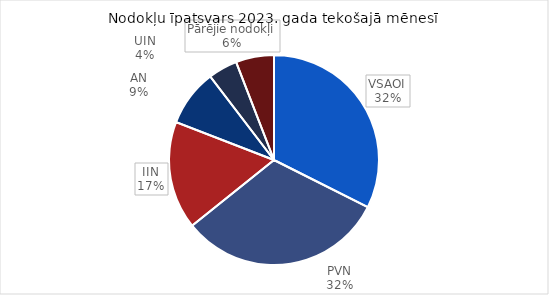
| Category | īpatsvars 2023 |
|---|---|
| VSAOI | 0.324 |
| PVN | 0.318 |
| IIN | 0.166 |
| AN | 0.088 |
| UIN | 0.045 |
| Pārējie nodokļi | 0.059 |